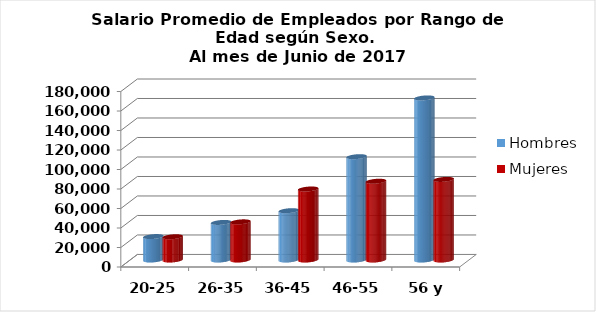
| Category | Hombres | Mujeres |
|---|---|---|
| 20-25 | 24036.154 | 23853.571 |
| 26-35 | 38539.68 | 39136.533 |
| 36-45 | 50591.542 | 72832.483 |
| 46-55 | 105991 | 80798.765 |
| 56 y más | 166271.909 | 82659.571 |